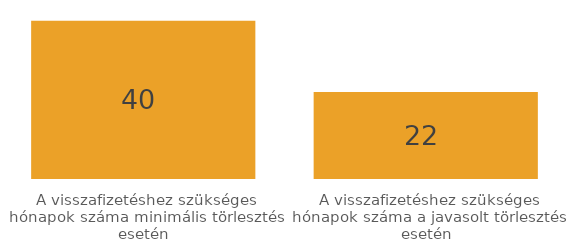
| Category | Series 0 |
|---|---|
| A visszafizetéshez szükséges hónapok száma minimális törlesztés esetén | 40 |
| A visszafizetéshez szükséges hónapok száma a javasolt törlesztés esetén | 22 |